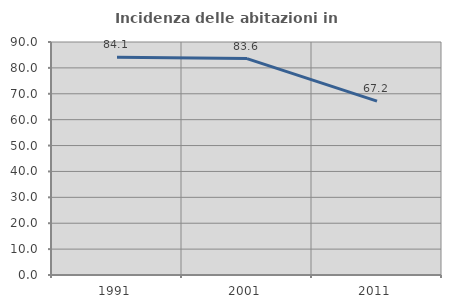
| Category | Incidenza delle abitazioni in proprietà  |
|---|---|
| 1991.0 | 84.1 |
| 2001.0 | 83.6 |
| 2011.0 | 67.17 |